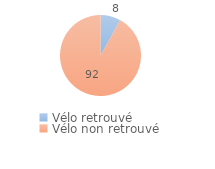
| Category | Series 0 |
|---|---|
| Vélo retrouvé | 8.098 |
| Vélo non retrouvé | 91.902 |